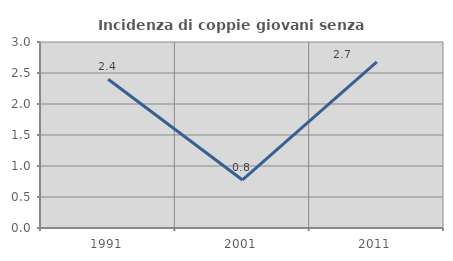
| Category | Incidenza di coppie giovani senza figli |
|---|---|
| 1991.0 | 2.4 |
| 2001.0 | 0.775 |
| 2011.0 | 2.679 |